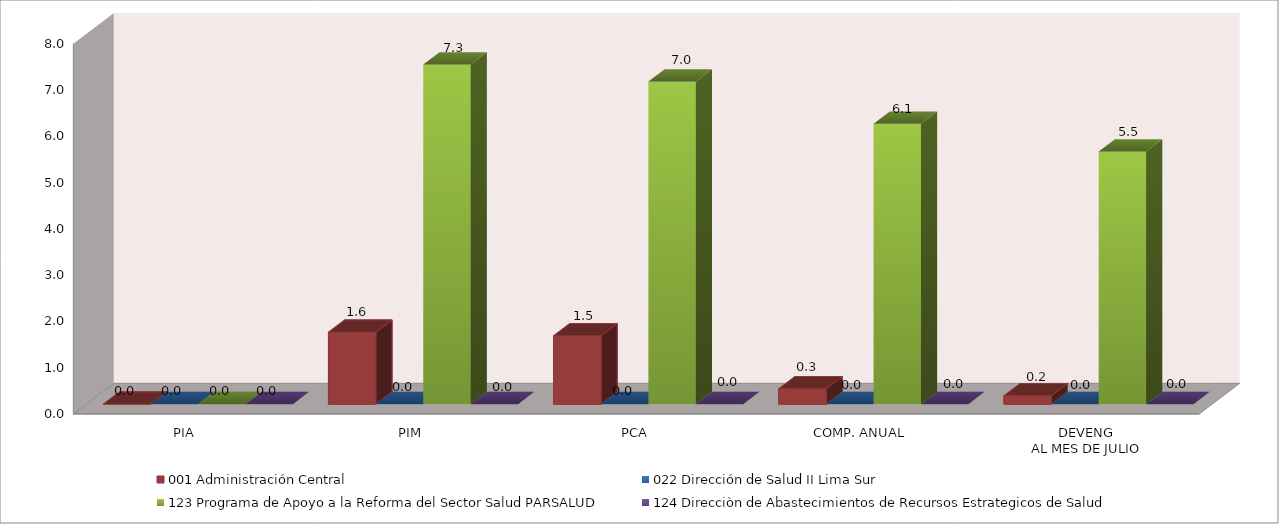
| Category | 001 Administración Central | 022 Dirección de Salud II Lima Sur | 123 Programa de Apoyo a la Reforma del Sector Salud PARSALUD | 124 Direcciòn de Abastecimientos de Recursos Estrategicos de Salud |
|---|---|---|---|---|
| PIA | 0 | 0 | 0 | 0 |
| PIM | 1.554 | 0.005 | 7.334 | 0 |
| PCA | 1.476 | 0.005 | 6.968 | 0 |
| COMP. ANUAL | 0.331 | 0.005 | 6.058 | 0 |
| DEVENG
AL MES DE JULIO | 0.18 | 0 | 5.455 | 0 |